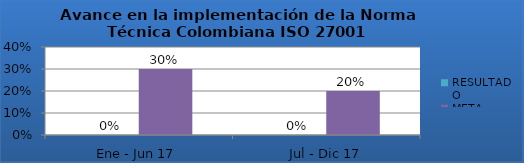
| Category | RESULTADO | META |
|---|---|---|
| Ene - Jun 17 | 0 | 0.3 |
| Jul - Dic 17 | 0 | 0.2 |